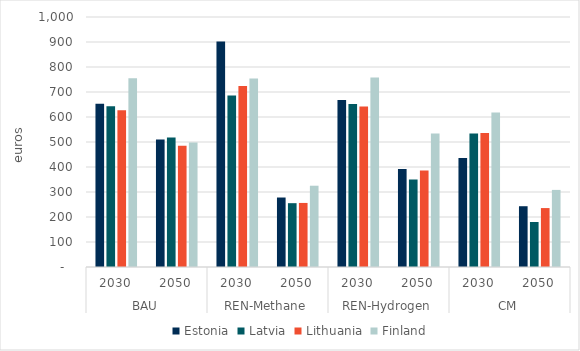
| Category | Estonia | Latvia | Lithuania | Finland |
|---|---|---|---|---|
| 0 | 652.709 | 643.203 | 626.964 | 755.176 |
| 1 | 510.349 | 517.731 | 484.891 | 498.191 |
| 2 | 902.282 | 685.82 | 724.077 | 753.951 |
| 3 | 277.933 | 255.29 | 256.243 | 325.101 |
| 4 | 667.745 | 652.367 | 641.85 | 758.453 |
| 5 | 392.458 | 349.669 | 385.634 | 534.38 |
| 6 | 435.521 | 533.971 | 536.224 | 618.135 |
| 7 | 243.117 | 180.078 | 235.704 | 308.402 |